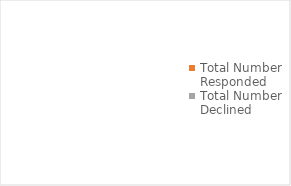
| Category | Series 0 |
|---|---|
| Total Number Responded | 0 |
| Total Number Declined | 0 |